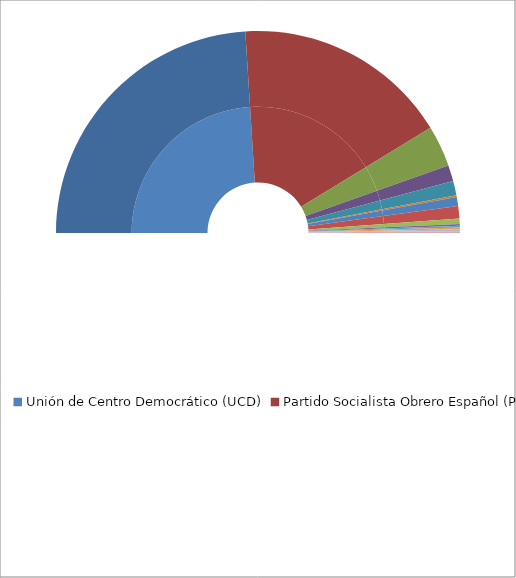
| Category | Escaños | Unión de Centro Democrático (UCD) |
|---|---|---|
| Unión de Centro Democrático (UCD) | 168 | 48 |
| Partido Socialista Obrero Español (PSOE) | 121 | 34.571 |
| Partido Comunista de España (PCE) | 23 | 6.571 |
| Coalición Democrática (CD) | 9 | 2.571 |
| Convergencia i Unió (C i U) | 8 | 2.286 |
| Unión Nacional  (UN) | 1 | 0.286 |
| Partido Socialista de Andalucía - Partido Andaluz (PSA-PA) | 5 | 1.429 |
| Partido Nacionalista Vasco ( PNV) | 7 | 2 |
| Herri Batasuna (HB) | 3 | 0.857 |
| Esquerra Republica de Catalunya (ERC) *** | 1 | 0.286 |
| Euskadiko Ezkerra (EE) | 1 | 0.286 |
| Unión del Pueblo Canario (UPC) | 1 | 0.286 |
| Partido Aragonés Regionalista (PAR) | 1 | 0.286 |
| Unión del Pueblo Navarro (UPN) | 1 | 0.286 |